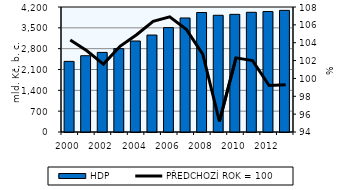
| Category | HDP |
|---|---|
| 2000.0 | 2372.6 |
| 2001.0 | 2562.679 |
| 2002.0 | 2674.634 |
| 2003.0 | 2801.2 |
| 2004.0 | 3057.7 |
| 2005.0 | 3258 |
| 2006.0 | 3507.1 |
| 2007.0 | 3831.8 |
| 2008.0 | 4015.3 |
| 2009.0 | 3921.8 |
| 2010.0 | 3953.7 |
| 2011.0 | 4022.4 |
| 2012.0 | 4047.7 |
| 2013.0 | 4086.3 |